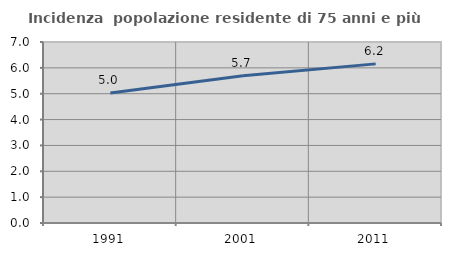
| Category | Incidenza  popolazione residente di 75 anni e più |
|---|---|
| 1991.0 | 5.027 |
| 2001.0 | 5.698 |
| 2011.0 | 6.154 |